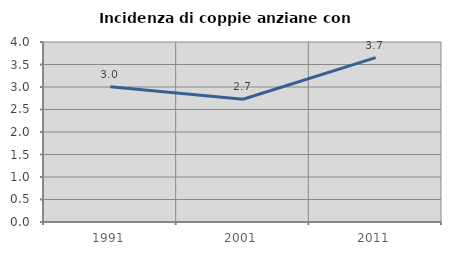
| Category | Incidenza di coppie anziane con figli |
|---|---|
| 1991.0 | 3.008 |
| 2001.0 | 2.727 |
| 2011.0 | 3.654 |